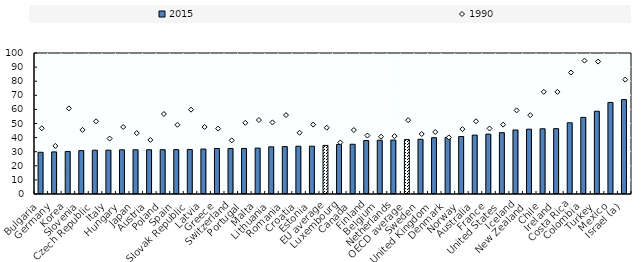
| Category | 2015 |
|---|---|
| Bulgaria | 29.6 |
| Germany | 29.862 |
| Korea | 30.169 |
| Slovenia | 30.771 |
| Czech Republic | 31.043 |
| Italy | 31.09 |
| Hungary | 31.334 |
| Japan | 31.363 |
| Austria | 31.377 |
| Poland | 31.414 |
| Spain | 31.485 |
| Slovak Republic | 31.555 |
| Latvia | 31.875 |
| Greece | 32.266 |
| Switzerland | 32.29 |
| Portugal | 32.293 |
| Malta | 32.541 |
| Lithuania | 33.446 |
| Romania | 33.631 |
| Croatia | 33.88 |
| Estonia | 33.908 |
| EU average | 34.462 |
| Luxembourg | 35.144 |
| Canada | 35.275 |
| Finland | 37.901 |
| Belgium | 38.117 |
| Netherlands | 38.268 |
| OECD average | 38.592 |
| Sweden | 38.8 |
| United Kingdom | 39.929 |
| Denmark | 40.116 |
| Norway | 40.779 |
| Australia | 41.781 |
| France | 42.464 |
| United States | 43.486 |
| Iceland | 45.405 |
| New Zealand | 45.976 |
| Chile | 46.252 |
| Ireland | 46.353 |
| Costa Rica | 50.504 |
| Colombia | 54.329 |
| Turkey | 58.708 |
| Mexico | 64.928 |
| Israel (a) | 66.95 |